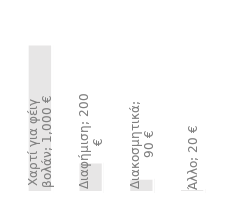
| Category | Ετήσια έξοδα |
|---|---|
| Χαρτί για φέιγ βολάν | 1000 |
| Διαφήμιση | 200 |
| Διακοσμητικά | 90 |
| Άλλο | 20 |